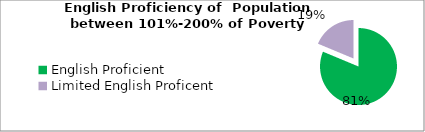
| Category | Percent |
|---|---|
| English Proficient | 0.813 |
| Limited English Proficent | 0.187 |